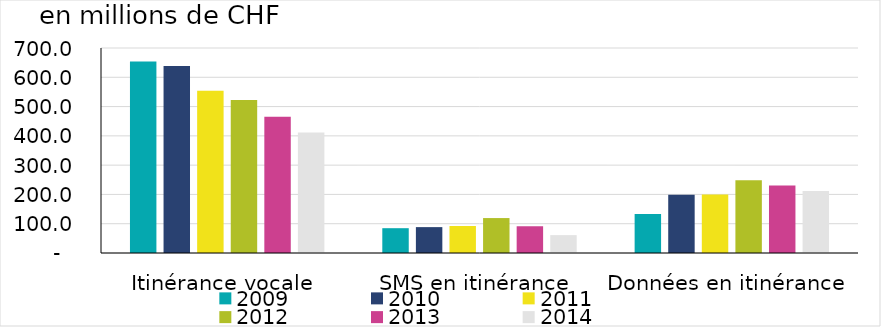
| Category | 2009 | 2010 | 2011 | 2012 | 2013 | 2014 |
|---|---|---|---|---|---|---|
| Itinérance vocale | 654.127 | 638.374 | 553.668 | 522.689 | 464.834 | 411.566 |
| SMS en itinérance | 84.701 | 88.383 | 92.169 | 119.294 | 91.344 | 61.011 |
| Données en itinérance | 132.796 | 199.16 | 199.573 | 248.416 | 230.172 | 211.707 |